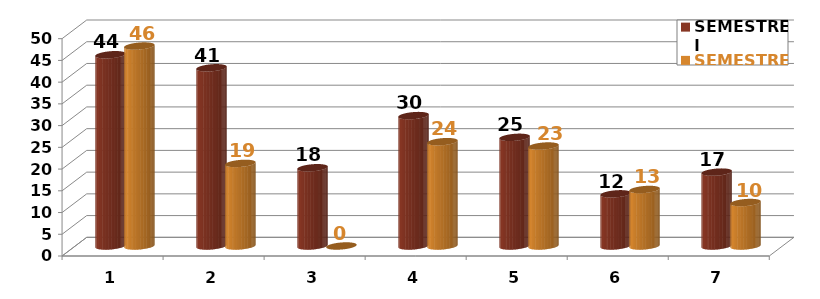
| Category | SEMESTRE I | SEMESTRE II |
|---|---|---|
| 1.0 | 44 | 46 |
| 2.0 | 41 | 19 |
| 3.0 | 18 | 0 |
| 4.0 | 30 | 24 |
| 5.0 | 25 | 23 |
| 6.0 | 12 | 13 |
| 7.0 | 17 | 10 |